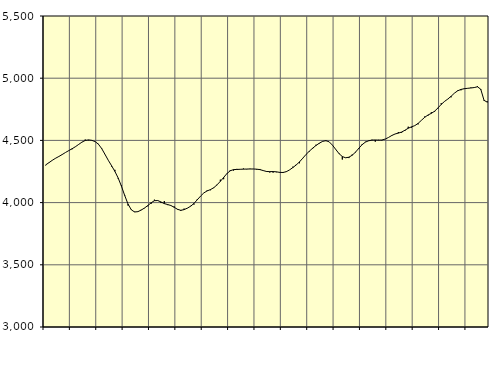
| Category | Piggar | Series 1 |
|---|---|---|
| nan | 4299.6 | 4302.85 |
| 87.0 | 4319.5 | 4320.87 |
| 87.0 | 4340.4 | 4339.79 |
| 87.0 | 4355.3 | 4356.32 |
| nan | 4371.7 | 4370.63 |
| 88.0 | 4384.7 | 4386.11 |
| 88.0 | 4402.2 | 4402.54 |
| 88.0 | 4418.8 | 4417.79 |
| nan | 4428.6 | 4432.63 |
| 89.0 | 4447.8 | 4448.62 |
| 89.0 | 4468.8 | 4467.32 |
| 89.0 | 4485 | 4485.98 |
| nan | 4507 | 4499.36 |
| 90.0 | 4500.9 | 4503.99 |
| 90.0 | 4499.3 | 4500.45 |
| 90.0 | 4489.2 | 4490.55 |
| nan | 4472.2 | 4469.86 |
| 91.0 | 4438.5 | 4434.47 |
| 91.0 | 4386.8 | 4387.93 |
| 91.0 | 4339.8 | 4340.25 |
| nan | 4290.2 | 4296.49 |
| 92.0 | 4263.4 | 4251.21 |
| 92.0 | 4193 | 4197.79 |
| 92.0 | 4137.7 | 4131.39 |
| nan | 4060.1 | 4056.12 |
| 93.0 | 3976.1 | 3987.63 |
| 93.0 | 3944.5 | 3941.72 |
| 93.0 | 3927.3 | 3924.56 |
| nan | 3926.6 | 3927.34 |
| 94.0 | 3942.6 | 3940.07 |
| 94.0 | 3954.9 | 3956.75 |
| 94.0 | 3970.7 | 3976.31 |
| nan | 3990.5 | 3998.85 |
| 95.0 | 4023.6 | 4015.35 |
| 95.0 | 4018.5 | 4016.52 |
| 95.0 | 3996.5 | 4004.92 |
| nan | 4012.7 | 3991.93 |
| 96.0 | 3979.8 | 3984.38 |
| 96.0 | 3975.7 | 3976.5 |
| 96.0 | 3969.1 | 3962.04 |
| nan | 3943.6 | 3946.07 |
| 97.0 | 3932.6 | 3938.09 |
| 97.0 | 3951.8 | 3943.47 |
| 97.0 | 3956.4 | 3955.57 |
| nan | 3973.9 | 3971.02 |
| 98.0 | 3983.9 | 3993.59 |
| 98.0 | 4028.5 | 4022.61 |
| 98.0 | 4051.2 | 4052.25 |
| nan | 4078 | 4078.07 |
| 99.0 | 4098.6 | 4093.96 |
| 99.0 | 4099.4 | 4104.6 |
| 99.0 | 4116.9 | 4119.55 |
| nan | 4140.5 | 4142.93 |
| 0.0 | 4184.4 | 4171.06 |
| 0.0 | 4188.1 | 4202.1 |
| 0.0 | 4236.5 | 4233.3 |
| nan | 4261.6 | 4255.85 |
| 1.0 | 4257.6 | 4265.09 |
| 1.0 | 4270.9 | 4266.54 |
| 1.0 | 4268.2 | 4267.8 |
| nan | 4274 | 4268.92 |
| 2.0 | 4267.7 | 4269.7 |
| 2.0 | 4272 | 4270.27 |
| 2.0 | 4270.6 | 4269.98 |
| nan | 4265.3 | 4268.73 |
| 3.0 | 4270.3 | 4265.29 |
| 3.0 | 4258.9 | 4257.48 |
| 3.0 | 4247.1 | 4250.19 |
| nan | 4241.9 | 4248.96 |
| 4.0 | 4240.8 | 4249.6 |
| 4.0 | 4244.2 | 4247.27 |
| 4.0 | 4240 | 4243 |
| nan | 4245.6 | 4242.08 |
| 5.0 | 4251.4 | 4248.45 |
| 5.0 | 4262.4 | 4262.85 |
| 5.0 | 4288.7 | 4281.87 |
| nan | 4304.6 | 4302.37 |
| 6.0 | 4316.1 | 4326.82 |
| 6.0 | 4358.1 | 4356.8 |
| 6.0 | 4385.7 | 4387.06 |
| nan | 4409.6 | 4413.5 |
| 7.0 | 4432.8 | 4437.39 |
| 7.0 | 4465.1 | 4458.77 |
| 7.0 | 4473.8 | 4477.18 |
| nan | 4493.4 | 4491.68 |
| 8.0 | 4494.3 | 4497.96 |
| 8.0 | 4488.8 | 4488.73 |
| 8.0 | 4462.5 | 4462.02 |
| nan | 4429.2 | 4427.72 |
| 9.0 | 4390.5 | 4393.7 |
| 9.0 | 4346.3 | 4370.13 |
| 9.0 | 4361.5 | 4360.32 |
| nan | 4358 | 4364.97 |
| 10.0 | 4386.9 | 4380.87 |
| 10.0 | 4402.3 | 4405.5 |
| 10.0 | 4430.6 | 4436.12 |
| nan | 4470.5 | 4465.42 |
| 11.0 | 4489 | 4486.14 |
| 11.0 | 4494.9 | 4497.08 |
| 11.0 | 4505.3 | 4502.24 |
| nan | 4489.7 | 4503.45 |
| 12.0 | 4504.6 | 4501.94 |
| 12.0 | 4500.2 | 4503.13 |
| 12.0 | 4509.6 | 4510.58 |
| nan | 4523.8 | 4523.43 |
| 13.0 | 4536.7 | 4539.27 |
| 13.0 | 4551.2 | 4551.53 |
| 13.0 | 4567 | 4558.57 |
| nan | 4561.9 | 4567.27 |
| 14.0 | 4576.8 | 4581.7 |
| 14.0 | 4610 | 4597.82 |
| 14.0 | 4602.6 | 4609.08 |
| nan | 4618.9 | 4618.98 |
| 15.0 | 4629.1 | 4636.76 |
| 15.0 | 4661.2 | 4661.64 |
| 15.0 | 4692.3 | 4685.6 |
| nan | 4699.5 | 4704.22 |
| 16.0 | 4726.4 | 4717.33 |
| 16.0 | 4729.4 | 4734.81 |
| 16.0 | 4757 | 4760.47 |
| nan | 4799 | 4789.12 |
| 17.0 | 4812.1 | 4813.16 |
| 17.0 | 4831.4 | 4832.32 |
| 17.0 | 4846.4 | 4854.6 |
| nan | 4879.9 | 4879.59 |
| 18.0 | 4901.6 | 4898.66 |
| 18.0 | 4902.8 | 4909.72 |
| 18.0 | 4918.2 | 4915.33 |
| nan | 4919.9 | 4918.65 |
| 19.0 | 4924.7 | 4921.45 |
| 19.0 | 4924.6 | 4924.77 |
| 19.0 | 4936.9 | 4930.96 |
| nan | 4906.5 | 4911.23 |
| 20.0 | 4817.3 | 4821.95 |
| 20.0 | 4813.9 | 4806.93 |